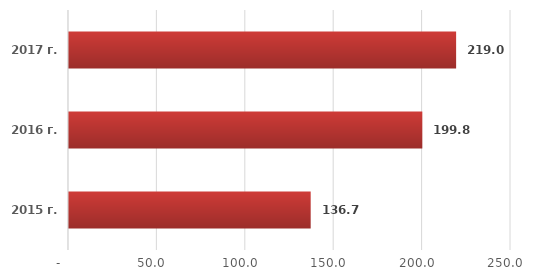
| Category | Series 0 |
|---|---|
| 2015 г. | 136.7 |
| 2016 г. | 199.84 |
| 2017 г. | 218.96 |